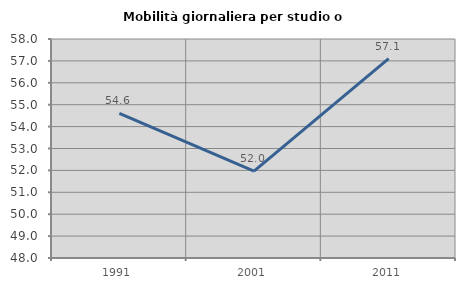
| Category | Mobilità giornaliera per studio o lavoro |
|---|---|
| 1991.0 | 54.609 |
| 2001.0 | 51.971 |
| 2011.0 | 57.104 |